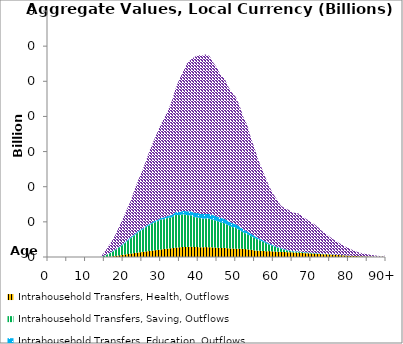
| Category | Intrahousehold Transfers, Health, Outflows | Intrahousehold Transfers, Saving, Outflows | Intrahousehold Transfers, Education, Outflows | Intrahousehold Transfers, Consumption other than health and education, Outflows |
|---|---|---|---|---|
| 0 | 0 | 0 | 0 | 0 |
|  | 0 | 0 | 0 | 0 |
| 2 | 0 | 0 | 0 | 0 |
| 3 | 0 | 0 | 0 | 0 |
| 4 | 0 | 0 | 0 | 0 |
| 5 | 0 | 0 | 0 | 0 |
| 6 | 0 | 0 | 0 | 0 |
| 7 | 0 | 0 | 0 | 0 |
| 8 | 0 | 0 | 0 | 0 |
| 9 | 0 | 0 | 0 | 0 |
| 10 | 0 | 0 | 0 | 0 |
| 11 | 0 | 0 | 0 | 0 |
| 12 | 0 | 0 | 0 | 0 |
| 13 | 0 | 0 | 0 | 0 |
| 14 | 0 | 0 | 0 | 0 |
| 15 | 0 | 0.404 | 0.028 | 0.944 |
| 16 | 0.011 | 0.816 | 0.071 | 1.982 |
| 17 | 0.163 | 1.232 | 0.115 | 3.064 |
| 18 | 0.317 | 1.68 | 0.163 | 4.251 |
| 19 | 0.472 | 2.249 | 0.196 | 5.96 |
| 20 | 0.628 | 2.907 | 0.227 | 7.31 |
| 21 | 0.784 | 3.637 | 0.251 | 8.877 |
| 22 | 0.951 | 4.38 | 0.289 | 10.318 |
| 23 | 1.124 | 4.974 | 0.322 | 12.62 |
| 24 | 1.284 | 5.762 | 0.333 | 14.473 |
| 25 | 1.423 | 6.245 | 0.338 | 16.333 |
| 26 | 1.582 | 6.874 | 0.349 | 18.242 |
| 27 | 1.713 | 7.301 | 0.361 | 20.794 |
| 28 | 1.851 | 7.855 | 0.384 | 22.624 |
| 29 | 2.005 | 8.057 | 0.422 | 24.738 |
| 30 | 2.137 | 8.515 | 0.463 | 26.549 |
| 31 | 2.305 | 8.466 | 0.524 | 28.416 |
| 32 | 2.393 | 8.779 | 0.584 | 30.052 |
| 33 | 2.516 | 8.761 | 0.675 | 32.573 |
| 34 | 2.668 | 9.342 | 0.773 | 35.222 |
| 35 | 2.752 | 9.151 | 0.872 | 37.895 |
| 36 | 2.861 | 9.312 | 0.971 | 39.658 |
| 37 | 2.865 | 9.064 | 1.081 | 42.095 |
| 38 | 2.922 | 8.937 | 1.154 | 43.136 |
| 39 | 2.851 | 8.499 | 1.231 | 44.371 |
| 40 | 2.807 | 8.405 | 1.269 | 44.957 |
| 41 | 2.784 | 8.12 | 1.297 | 45.106 |
| 42 | 2.816 | 8.118 | 1.333 | 45.394 |
| 43 | 2.79 | 8.078 | 1.351 | 45.002 |
| 44 | 2.721 | 7.869 | 1.318 | 43.391 |
| 45 | 2.661 | 7.586 | 1.299 | 42.337 |
| 46 | 2.558 | 7.301 | 1.278 | 40.587 |
| 47 | 2.604 | 7.001 | 1.266 | 39.951 |
| 48 | 2.455 | 6.567 | 1.197 | 38.245 |
| 49 | 2.449 | 6.1 | 1.135 | 37.074 |
| 50 | 2.348 | 5.905 | 1.06 | 36.214 |
| 51 | 2.37 | 5.353 | 0.997 | 34.419 |
| 52 | 2.33 | 4.646 | 0.891 | 31.99 |
| 53 | 2.197 | 4.328 | 0.806 | 30.356 |
| 54 | 2.07 | 3.917 | 0.69 | 27.317 |
| 55 | 1.865 | 3.569 | 0.58 | 24.93 |
| 56 | 1.792 | 3.11 | 0.487 | 22.225 |
| 57 | 1.733 | 2.717 | 0.416 | 20.196 |
| 58 | 1.654 | 2.31 | 0.36 | 18.037 |
| 59 | 1.678 | 1.818 | 0.312 | 16.094 |
| 60 | 1.588 | 1.506 | 0.248 | 14.542 |
| 61 | 1.516 | 1.173 | 0.217 | 13.394 |
| 62 | 1.459 | 0.898 | 0.185 | 12.055 |
| 63 | 1.446 | 0.628 | 0.173 | 11.685 |
| 64 | 1.341 | 0.406 | 0.151 | 11.561 |
| 65 | 1.325 | 0.276 | 0.128 | 10.925 |
| 66 | 1.246 | 0.257 | 0.121 | 10.911 |
| 67 | 1.224 | 0.251 | 0.112 | 10.707 |
| 68 | 1.134 | 0.196 | 0.11 | 9.896 |
| 69 | 1.048 | 0.165 | 0.106 | 9.327 |
| 70 | 1.009 | 0.147 | 0.093 | 8.621 |
| 71 | 0.962 | 0.122 | 0.088 | 8.105 |
| 72 | 0.876 | 0.112 | 0.073 | 7.325 |
| 73 | 0.791 | 0.079 | 0.069 | 6.405 |
| 74 | 0.774 | 0.053 | 0.069 | 5.76 |
| 75 | 0.739 | 0.025 | 0.061 | 4.94 |
| 76 | 0.665 | 0.012 | 0.057 | 4.268 |
| 77 | 0.592 | 0.007 | 0.05 | 3.709 |
| 78 | 0.52 | 0.006 | 0.039 | 3.099 |
| 79 | 0.451 | 0.004 | 0.036 | 2.546 |
| 80 | 0.386 | 0.003 | 0.028 | 2.144 |
| 81 | 0.325 | 0.002 | 0.025 | 1.681 |
| 82 | 0.269 | 0.003 | 0.02 | 1.284 |
| 83 | 0.219 | 0.002 | 0.013 | 0.99 |
| 84 | 0.175 | 0.002 | 0.009 | 0.771 |
| 85 | 0.147 | 0.002 | 0.006 | 0.622 |
| 86 | 0.116 | 0.001 | 0.005 | 0.479 |
| 87 | 0.09 | 0.001 | 0.003 | 0.351 |
| 88 | 0.068 | 0.001 | 0.002 | 0.25 |
| 89 | 0.049 | 0 | 0.001 | 0.172 |
| 90+ | 0.102 | 0.001 | 0.003 | 0.334 |